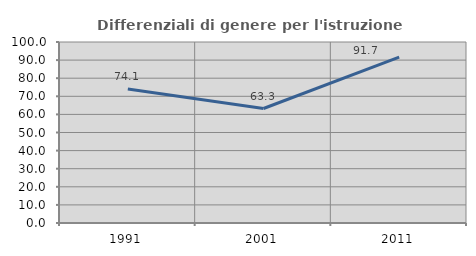
| Category | Differenziali di genere per l'istruzione superiore |
|---|---|
| 1991.0 | 74.065 |
| 2001.0 | 63.258 |
| 2011.0 | 91.66 |